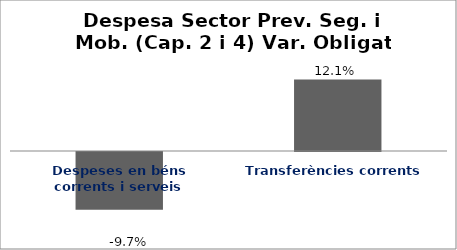
| Category | Series 0 |
|---|---|
| Despeses en béns corrents i serveis | -0.097 |
| Transferències corrents | 0.121 |